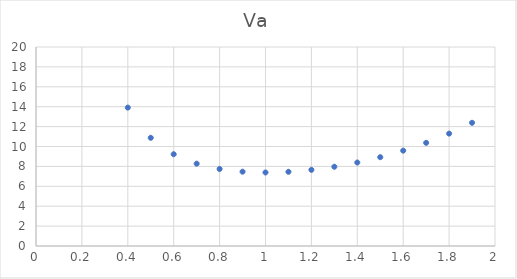
| Category | Va |
|---|---|
| 0.001 | 1002002.001 |
| 0.1 | 122.14 |
| 0.2 | 37.296 |
| 0.30000000000000004 | 20.246 |
| 0.4 | 13.91 |
| 0.5 | 10.873 |
| 0.6 | 9.223 |
| 0.7 | 8.276 |
| 0.7999999999999999 | 7.739 |
| 0.8999999999999999 | 7.469 |
| 0.9999999999999999 | 7.389 |
| 1.0999999999999999 | 7.459 |
| 1.2 | 7.655 |
| 1.3 | 7.967 |
| 1.4000000000000001 | 8.39 |
| 1.5000000000000002 | 8.927 |
| 1.6000000000000003 | 9.583 |
| 1.7000000000000004 | 10.368 |
| 1.8000000000000005 | 11.296 |
| 1.9000000000000006 | 12.383 |